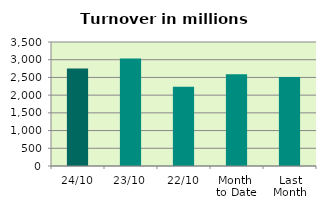
| Category | Series 0 |
|---|---|
| 24/10 | 2754.277 |
| 23/10 | 3032.506 |
| 22/10 | 2235.342 |
| Month 
to Date | 2589.488 |
| Last
Month | 2513.15 |